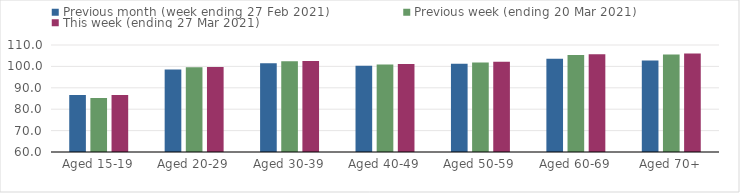
| Category | Previous month (week ending 27 Feb 2021) | Previous week (ending 20 Mar 2021) | This week (ending 27 Mar 2021) |
|---|---|---|---|
| Aged 15-19 | 86.62 | 85.21 | 86.65 |
| Aged 20-29 | 98.51 | 99.66 | 99.7 |
| Aged 30-39 | 101.47 | 102.43 | 102.53 |
| Aged 40-49 | 100.36 | 100.85 | 101.12 |
| Aged 50-59 | 101.22 | 101.82 | 102.15 |
| Aged 60-69 | 103.59 | 105.27 | 105.69 |
| Aged 70+ | 102.76 | 105.53 | 106.08 |